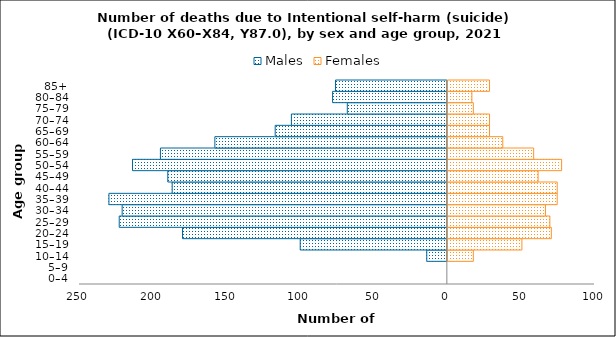
| Category | Males | Females |
|---|---|---|
| 0–4 | 0 | 0 |
| 5–9 | 0 | 0 |
| 10–14 | -14 | 18 |
| 15–19 | -100 | 51 |
| 20–24 | -180 | 71 |
| 25–29 | -223 | 70 |
| 30–34 | -221 | 67 |
| 35–39 | -230 | 75 |
| 40–44 | -187 | 75 |
| 45–49 | -190 | 62 |
| 50–54 | -214 | 78 |
| 55–59 | -195 | 59 |
| 60–64 | -158 | 38 |
| 65–69 | -117 | 29 |
| 70–74 | -106 | 29 |
| 75–79 | -68 | 18 |
| 80–84 | -78 | 17 |
| 85+ | -76 | 29 |